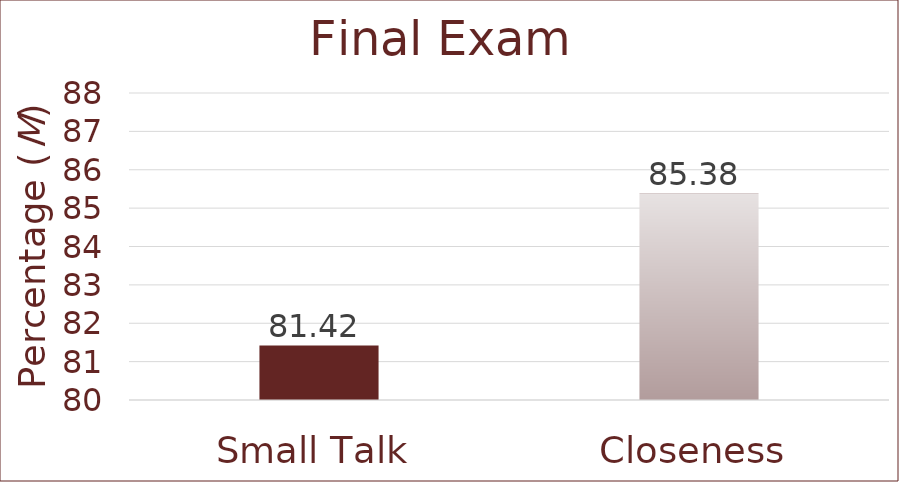
| Category | Final Exam |
|---|---|
| Small Talk | 81.42 |
| Closeness | 85.38 |